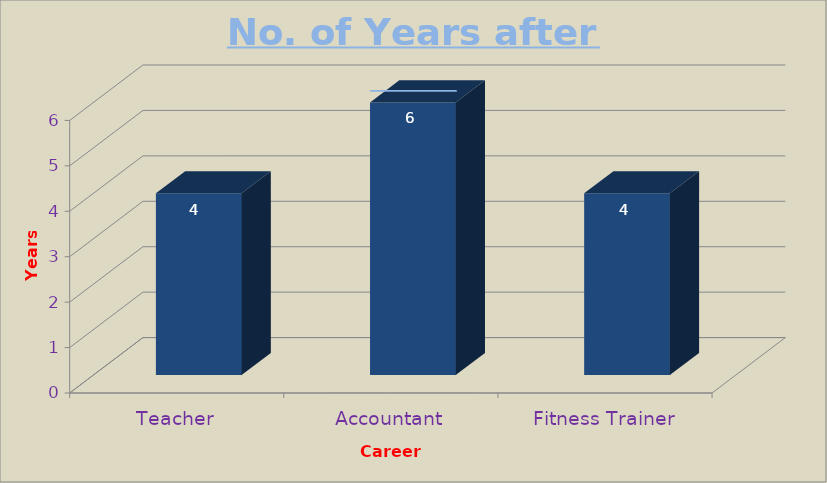
| Category | No. of Years after H.S. |
|---|---|
| Teacher | 4 |
| Accountant | 6 |
| Fitness Trainer | 4 |